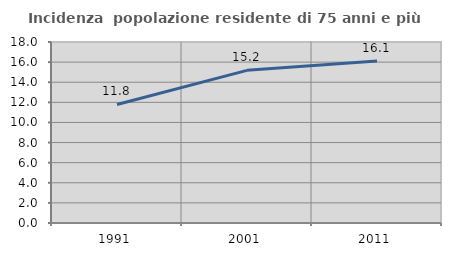
| Category | Incidenza  popolazione residente di 75 anni e più |
|---|---|
| 1991.0 | 11.79 |
| 2001.0 | 15.181 |
| 2011.0 | 16.113 |